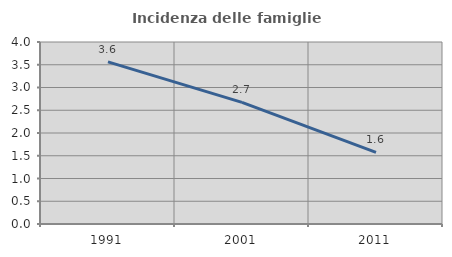
| Category | Incidenza delle famiglie numerose |
|---|---|
| 1991.0 | 3.564 |
| 2001.0 | 2.672 |
| 2011.0 | 1.576 |